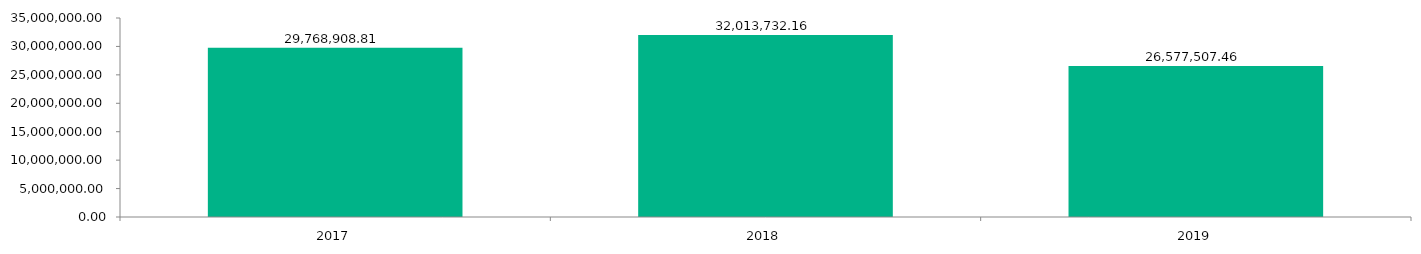
| Category | Series 0 |
|---|---|
| 2017.0 | 29768908.81 |
| 2018.0 | 32013732.16 |
| 2019.0 | 26577507.46 |